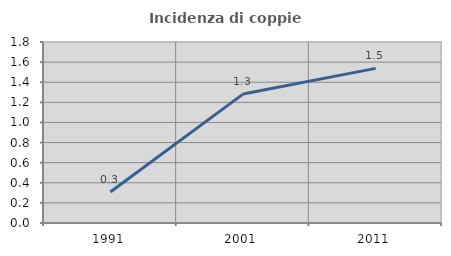
| Category | Incidenza di coppie miste |
|---|---|
| 1991.0 | 0.308 |
| 2001.0 | 1.282 |
| 2011.0 | 1.537 |